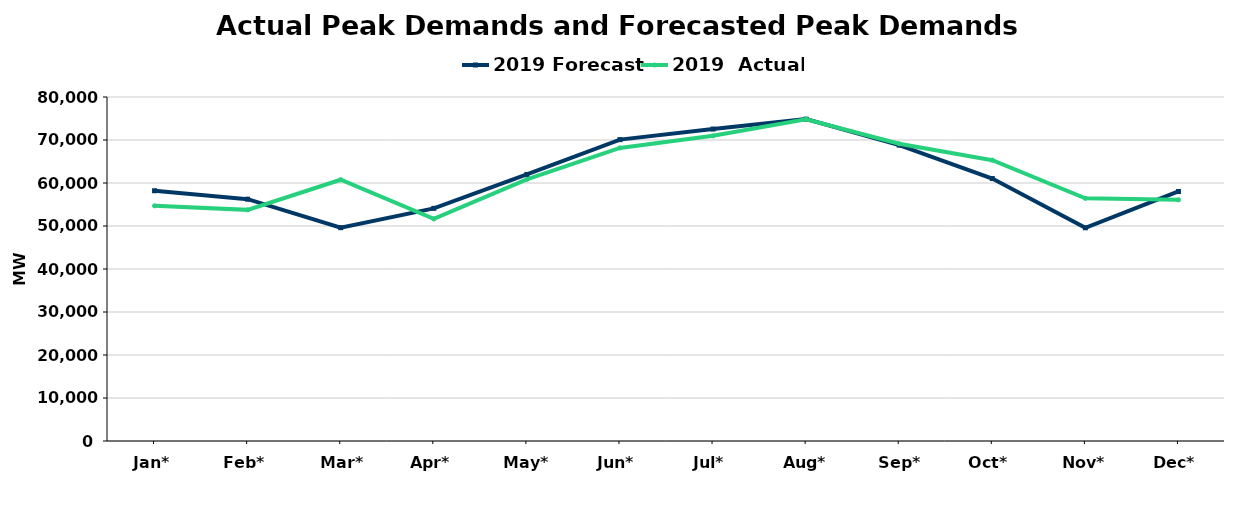
| Category | 2019 Forecast | 2019  Actual |
|---|---|---|
| Jan* | 58196 | 54693 |
| Feb* | 56235 | 53752 |
| Mar* | 49612 | 60756 |
| Apr* | 54108 | 51640 |
| May* | 61992 | 60832 |
| Jun* | 70089 | 68159 |
| Jul* | 72543 | 70970 |
| Aug* | 74853 | 74820 |
| Sep* | 68803 | 69122 |
| Oct* | 61034 | 65304 |
| Nov* | 49585 | 56446 |
| Dec* | 58027 | 56080 |